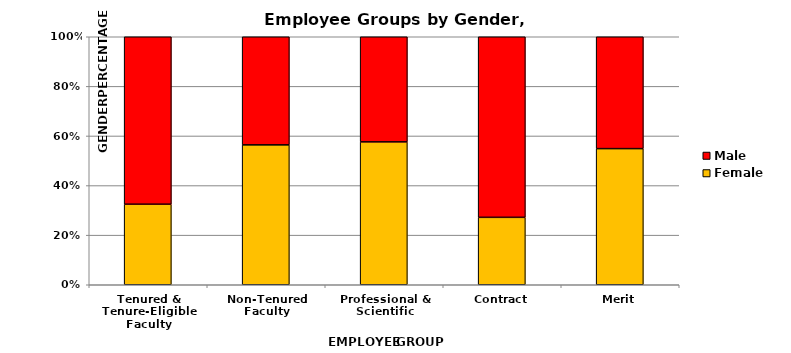
| Category | Female | Male |
|---|---|---|
| Tenured & Tenure-Eligible Faculty | 0.325 | 0.675 |
| Non-Tenured Faculty | 0.564 | 0.436 |
| Professional & Scientific | 0.576 | 0.424 |
| Contract | 0.272 | 0.728 |
| Merit | 0.549 | 0.451 |